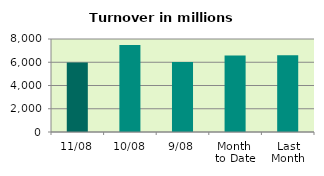
| Category | Series 0 |
|---|---|
| 11/08 | 5976.233 |
| 10/08 | 7491.516 |
| 9/08 | 6028.456 |
| Month 
to Date | 6582.526 |
| Last
Month | 6596.254 |